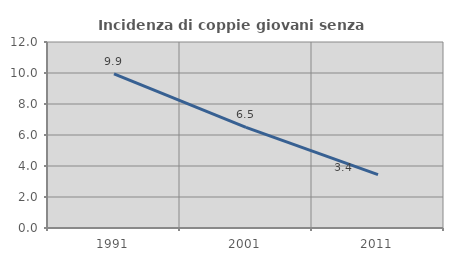
| Category | Incidenza di coppie giovani senza figli |
|---|---|
| 1991.0 | 9.944 |
| 2001.0 | 6.497 |
| 2011.0 | 3.44 |